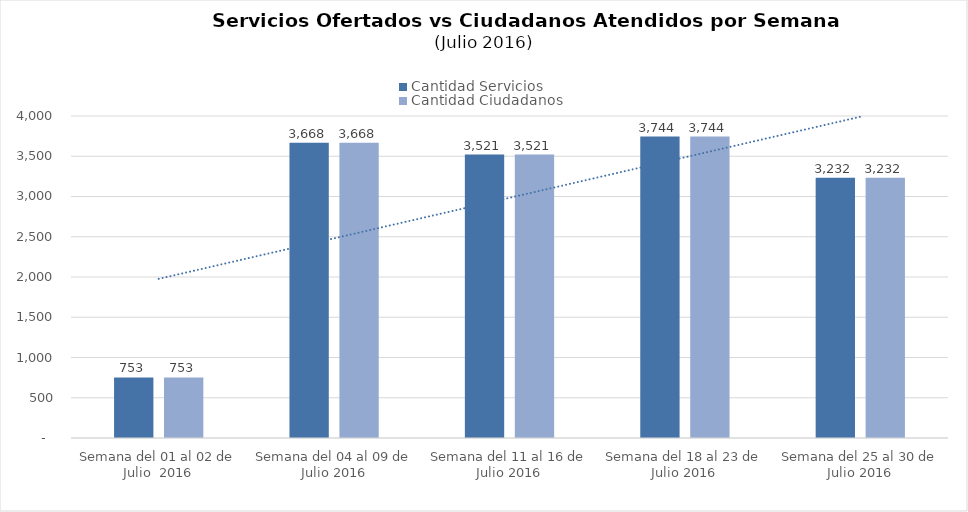
| Category | Cantidad Servicios | Cantidad Ciudadanos |
|---|---|---|
| Semana del 01 al 02 de Julio  2016 | 753 | 753 |
| Semana del 04 al 09 de Julio 2016 | 3668 | 3668 |
| Semana del 11 al 16 de Julio 2016 | 3521 | 3521 |
| Semana del 18 al 23 de Julio 2016 | 3744 | 3744 |
| Semana del 25 al 30 de Julio 2016 | 3232 | 3232 |